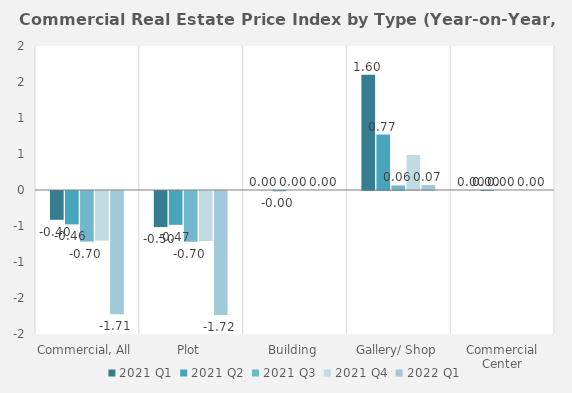
| Category | 2021 | 2022 |
|---|---|---|
| Commercial, All | -0.69 | -1.712 |
| Plot | -0.695 | -1.721 |
| Building | 0 | 0 |
| Gallery/ Shop | 0.486 | 0.07 |
| Commercial Center | 0 | 0 |